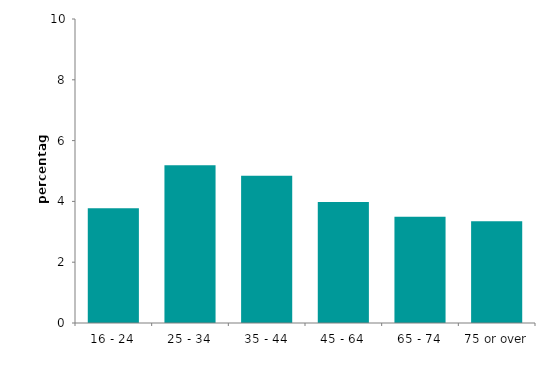
| Category | Series 0 |
|---|---|
| 16 - 24 | 3.776 |
| 25 - 34 | 5.192 |
| 35 - 44 | 4.843 |
| 45 - 64 | 3.984 |
| 65 - 74 | 3.499 |
| 75 or over | 3.346 |